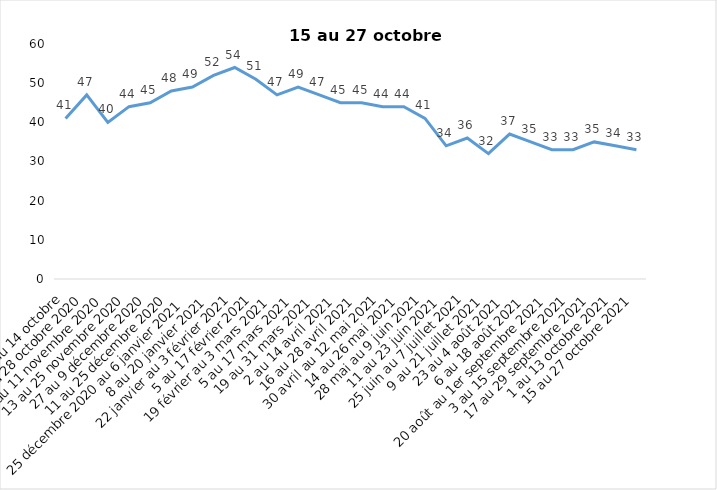
| Category | Toujours aux trois mesures |
|---|---|
| 2 au 14 octobre | 41 |
| 16 au 28 octobre 2020 | 47 |
| 30 octobre au 11 novembre 2020 | 40 |
| 13 au 25 novembre 2020 | 44 |
| 27 au 9 décembre 2020 | 45 |
| 11 au 25 décembre 2020 | 48 |
| 25 décembre 2020 au 6 janvier 2021 | 49 |
| 8 au 20 janvier 2021 | 52 |
| 22 janvier au 3 février 2021 | 54 |
| 5 au 17 février 2021 | 51 |
| 19 février au 3 mars 2021 | 47 |
| 5 au 17 mars 2021 | 49 |
| 19 au 31 mars 2021 | 47 |
| 2 au 14 avril 2021 | 45 |
| 16 au 28 avril 2021 | 45 |
| 30 avril au 12 mai 2021 | 44 |
| 14 au 26 mai 2021 | 44 |
| 28 mai au 9 juin 2021 | 41 |
| 11 au 23 juin 2021 | 34 |
| 25 juin au 7 juillet 2021 | 36 |
| 9 au 21 juillet 2021 | 32 |
| 23 au 4 août 2021 | 37 |
| 6 au 18 août 2021 | 35 |
| 20 août au 1er septembre 2021 | 33 |
| 3 au 15 septembre 2021 | 33 |
| 17 au 29 septembre 2021 | 35 |
| 1 au 13 octobre 2021 | 34 |
| 15 au 27 octobre 2021 | 33 |